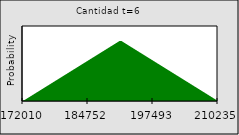
| Category | Series 0 |
|---|---|
| 172010.057592971 | 0 |
| nan | 0 |
| nan | 0.001 |
| nan | 0.001 |
| nan | 0.002 |
| nan | 0.002 |
| nan | 0.002 |
| nan | 0.003 |
| nan | 0.003 |
| nan | 0.004 |
| nan | 0.004 |
| nan | 0.004 |
| nan | 0.005 |
| nan | 0.005 |
| nan | 0.006 |
| nan | 0.006 |
| nan | 0.007 |
| nan | 0.007 |
| nan | 0.007 |
| nan | 0.008 |
| nan | 0.008 |
| nan | 0.009 |
| nan | 0.009 |
| nan | 0.009 |
| nan | 0.01 |
| nan | 0.01 |
| nan | 0.011 |
| nan | 0.011 |
| nan | 0.011 |
| nan | 0.012 |
| nan | 0.012 |
| nan | 0.013 |
| nan | 0.013 |
| 184751.54334059867 | 0.013 |
| nan | 0.014 |
| nan | 0.014 |
| nan | 0.015 |
| nan | 0.015 |
| nan | 0.016 |
| nan | 0.016 |
| nan | 0.016 |
| nan | 0.017 |
| nan | 0.017 |
| nan | 0.018 |
| nan | 0.018 |
| nan | 0.018 |
| nan | 0.019 |
| nan | 0.019 |
| nan | 0.02 |
| nan | 0.02 |
| nan | 0.02 |
| nan | 0.02 |
| nan | 0.019 |
| nan | 0.019 |
| nan | 0.018 |
| nan | 0.018 |
| nan | 0.018 |
| nan | 0.017 |
| nan | 0.017 |
| nan | 0.016 |
| nan | 0.016 |
| nan | 0.016 |
| nan | 0.015 |
| nan | 0.015 |
| nan | 0.014 |
| nan | 0.014 |
| 197493.02908822632 | 0.013 |
| nan | 0.013 |
| nan | 0.013 |
| nan | 0.012 |
| nan | 0.012 |
| nan | 0.011 |
| nan | 0.011 |
| nan | 0.011 |
| nan | 0.01 |
| nan | 0.01 |
| nan | 0.009 |
| nan | 0.009 |
| nan | 0.009 |
| nan | 0.008 |
| nan | 0.008 |
| nan | 0.007 |
| nan | 0.007 |
| nan | 0.007 |
| nan | 0.006 |
| nan | 0.006 |
| nan | 0.005 |
| nan | 0.005 |
| nan | 0.004 |
| nan | 0.004 |
| nan | 0.004 |
| nan | 0.003 |
| nan | 0.003 |
| nan | 0.002 |
| nan | 0.002 |
| nan | 0.002 |
| nan | 0.001 |
| nan | 0.001 |
| nan | 0 |
| 210234.514835854 | 0 |